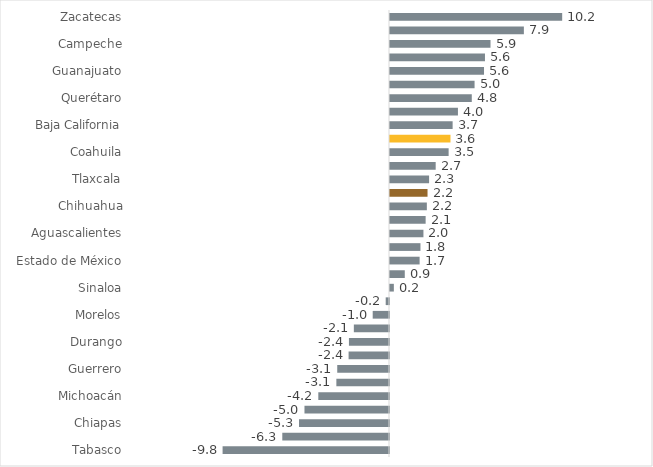
| Category | Series 0 |
|---|---|
| Tabasco | -9.827 |
| Colima | -6.302 |
| Chiapas | -5.314 |
| Baja California Sur | -4.992 |
| Michoacán | -4.174 |
| Ciudad de México | -3.109 |
| Guerrero | -3.057 |
| Oaxaca | -2.386 |
| Durango | -2.366 |
| Puebla | -2.076 |
| Morelos | -0.963 |
| Veracruz | -0.195 |
| Sinaloa | 0.227 |
| Sonora | 0.873 |
| Estado de México | 1.749 |
| Nuevo León | 1.799 |
| Aguascalientes | 1.975 |
| Tamaulipas | 2.105 |
| Chihuahua | 2.176 |
| Nacional | 2.216 |
| Tlaxcala | 2.309 |
| Nayarit | 2.698 |
| Coahuila | 3.462 |
| Jalisco | 3.571 |
| Baja California | 3.699 |
| Hidalgo | 4.012 |
| Querétaro | 4.83 |
| Yucatán | 4.995 |
| Guanajuato | 5.552 |
| San Luis Potosí | 5.609 |
| Campeche | 5.935 |
| Quintana Roo | 7.906 |
| Zacatecas | 10.168 |